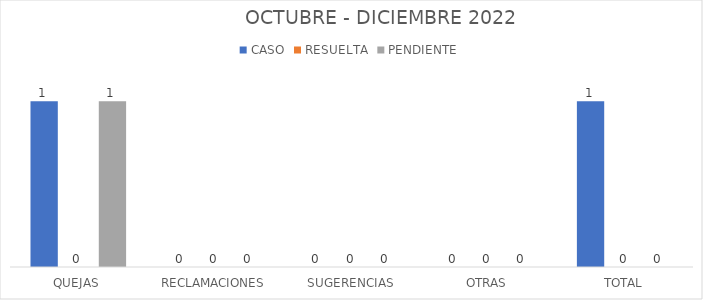
| Category | CASO | RESUELTA | PENDIENTE |
|---|---|---|---|
| QUEJAS | 1 | 0 | 1 |
| RECLAMACIONES | 0 | 0 | 0 |
| SUGERENCIAS | 0 | 0 | 0 |
| OTRAS | 0 | 0 | 0 |
| TOTAL | 1 | 0 | 0 |